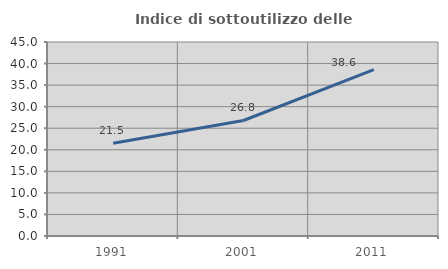
| Category | Indice di sottoutilizzo delle abitazioni  |
|---|---|
| 1991.0 | 21.493 |
| 2001.0 | 26.796 |
| 2011.0 | 38.596 |